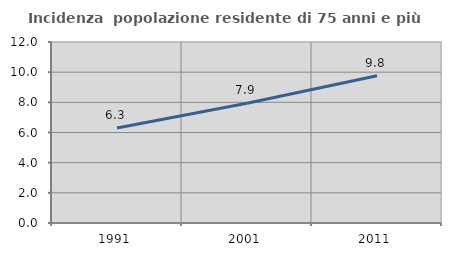
| Category | Incidenza  popolazione residente di 75 anni e più |
|---|---|
| 1991.0 | 6.298 |
| 2001.0 | 7.935 |
| 2011.0 | 9.768 |